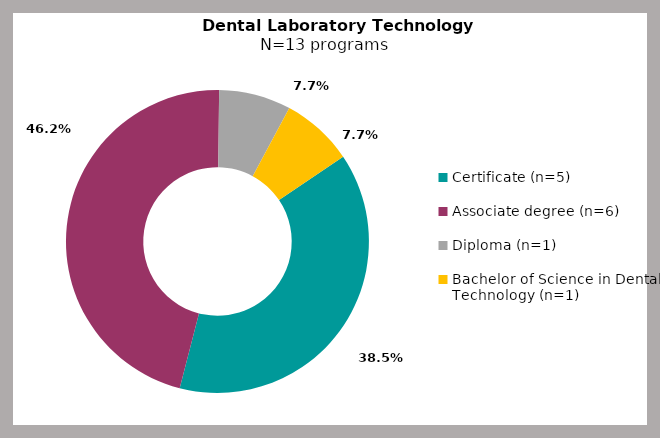
| Category | Series 0 |
|---|---|
| Certificate (n=5) | 0.385 |
| Associate degree (n=6) | 0.462 |
| Diploma (n=1) | 0.077 |
| Bachelor of Science in Dental Technology (n=1) | 0.077 |